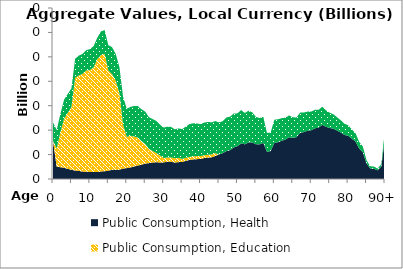
| Category | Public Consumption, Health | Public Consumption, Education | Public Consumption, Other than health and education |
|---|---|---|---|
| 0 | 31.328 | 0 | 15.057 |
|  | 9.984 | 15.096 | 15.022 |
| 2 | 9.68 | 28.385 | 15.133 |
| 3 | 9.13 | 40.32 | 15.502 |
| 4 | 8.352 | 45.808 | 15.577 |
| 5 | 7.512 | 51.375 | 15.336 |
| 6 | 6.899 | 76.004 | 15.507 |
| 7 | 6.611 | 78.14 | 16.274 |
| 8 | 6.098 | 79.971 | 16.367 |
| 9 | 5.864 | 82.961 | 16.625 |
| 10 | 5.803 | 83.429 | 17.07 |
| 11 | 5.727 | 85.672 | 17.414 |
| 12 | 5.65 | 92.415 | 17.578 |
| 13 | 6.175 | 95.362 | 19.295 |
| 14 | 6.334 | 96.129 | 19.48 |
| 15 | 6.847 | 82.118 | 20.6 |
| 16 | 7.503 | 78.404 | 22.086 |
| 17 | 7.615 | 72.962 | 21.857 |
| 18 | 7.65 | 62.741 | 21.3 |
| 19 | 8.492 | 35.95 | 22.817 |
| 20 | 8.925 | 25.545 | 23.128 |
| 21 | 9.447 | 25.934 | 23.67 |
| 22 | 10.28 | 24.546 | 24.984 |
| 23 | 11.008 | 22.898 | 25.762 |
| 24 | 11.723 | 19.352 | 26.034 |
| 25 | 12.61 | 16.056 | 26.472 |
| 26 | 12.979 | 11.791 | 25.921 |
| 27 | 13.462 | 9.429 | 26.166 |
| 28 | 13.742 | 7.58 | 26.3 |
| 29 | 13.502 | 5.729 | 25.281 |
| 30 | 13.625 | 3.554 | 24.943 |
| 31 | 14.064 | 3.557 | 25.242 |
| 32 | 14.116 | 3.555 | 25.007 |
| 33 | 13.462 | 3.543 | 23.692 |
| 34 | 13.782 | 3.547 | 24.11 |
| 35 | 14.032 | 2.463 | 24.388 |
| 36 | 14.826 | 2.474 | 25.606 |
| 37 | 15.628 | 2.485 | 26.852 |
| 38 | 16.013 | 2.487 | 27.103 |
| 39 | 16.242 | 2.484 | 26.75 |
| 40 | 16.396 | 2.337 | 26.205 |
| 41 | 17.146 | 2.341 | 26.684 |
| 42 | 17.539 | 2.343 | 26.865 |
| 43 | 17.741 | 2.337 | 26.285 |
| 44 | 18.828 | 2.337 | 26.269 |
| 45 | 20.06 | 0 | 26.283 |
| 46 | 21.103 | 0 | 26.17 |
| 47 | 22.814 | 0 | 27.553 |
| 48 | 23.619 | 0 | 27.459 |
| 49 | 25.803 | 0 | 27.82 |
| 50 | 26.894 | 0 | 26.858 |
| 51 | 29.134 | 0 | 27.318 |
| 52 | 28.359 | 0 | 25.695 |
| 53 | 29.861 | 0 | 26.08 |
| 54 | 29.884 | 0 | 24.774 |
| 55 | 28.427 | 0 | 22.495 |
| 56 | 28.365 | 0 | 21.486 |
| 57 | 29.579 | 0 | 21.403 |
| 58 | 22.317 | 0 | 15.43 |
| 59 | 22.824 | 0 | 15.229 |
| 60 | 29.484 | 0 | 19.058 |
| 61 | 30.114 | 0 | 18.762 |
| 62 | 31.327 | 0 | 18.507 |
| 63 | 32.283 | 0 | 17.912 |
| 64 | 34.159 | 0 | 17.874 |
| 65 | 33.778 | 0 | 16.762 |
| 66 | 34.293 | 0 | 16.09 |
| 67 | 37.736 | 0 | 16.639 |
| 68 | 38.4 | 0 | 15.976 |
| 69 | 39.518 | 0 | 15.693 |
| 70 | 39.915 | 0 | 15.257 |
| 71 | 41.482 | 0 | 15.167 |
| 72 | 42.013 | 0 | 14.625 |
| 73 | 44.372 | 0 | 14.756 |
| 74 | 42.695 | 0 | 13.553 |
| 75 | 41.769 | 0 | 12.552 |
| 76 | 41.204 | 0 | 11.826 |
| 77 | 39.632 | 0 | 10.926 |
| 78 | 38.066 | 0 | 10.056 |
| 79 | 36.103 | 0 | 9.133 |
| 80 | 35.451 | 0 | 8.601 |
| 81 | 33.007 | 0 | 7.702 |
| 82 | 30.65 | 0 | 6.896 |
| 83 | 24.913 | 0 | 5.517 |
| 84 | 21.81 | 0 | 4.762 |
| 85 | 12.606 | 0 | 2.718 |
| 86 | 8.617 | 0 | 1.836 |
| 87 | 8.405 | 0 | 1.769 |
| 88 | 7.075 | 0 | 1.472 |
| 89 | 10.137 | 0 | 2.087 |
| 90+ | 33.709 | 0 | 6.942 |